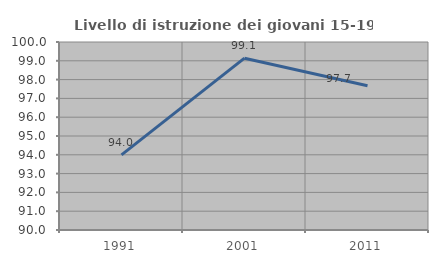
| Category | Livello di istruzione dei giovani 15-19 anni |
|---|---|
| 1991.0 | 93.997 |
| 2001.0 | 99.14 |
| 2011.0 | 97.674 |